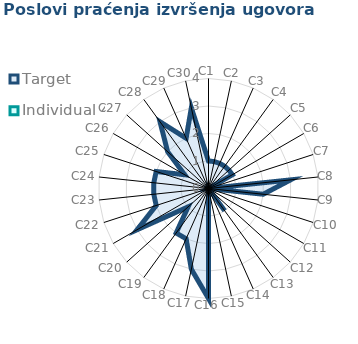
| Category | Target | Individual 4 |
|---|---|---|
| C1 | 1 | 0 |
| C2 | 1 | 0 |
| C3 | 1 | 0 |
| C4 | 1 | 0 |
| C5 | 1 | 0 |
| C6 | 1 | 0 |
| C7 | 0 | 0 |
| C8 | 3 | 0 |
| C9 | 2 | 0 |
| C10 | 0 | 0 |
| C11 | 0 | 0 |
| C12 | 0 | 0 |
| C13 | 1 | 0 |
| C14 | 0 | 0 |
| C15 | 0 | 0 |
| C16 | 4 | 0 |
| C17 | 3 | 0 |
| C18 | 2 | 0 |
| C19 | 2 | 0 |
| C20 | 1 | 0 |
| C21 | 3 | 0 |
| C22 | 2 | 0 |
| C23 | 2 | 0 |
| C24 | 2 | 0 |
| C25 | 2 | 0 |
| C26 | 1 | 0 |
| C27 | 2 | 0 |
| C28 | 3 | 0 |
| C29 | 2 | 0 |
| C30 | 3 | 0 |